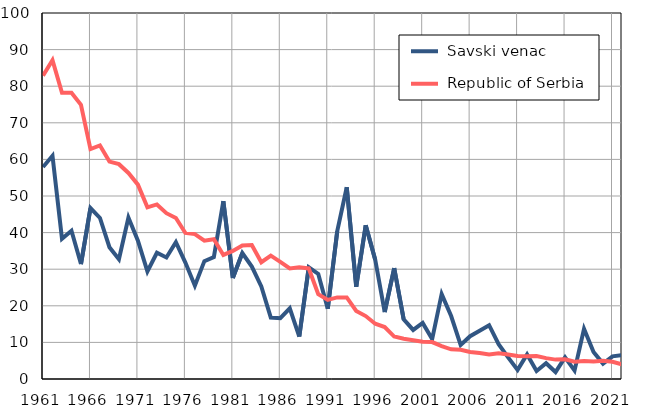
| Category |  Savski venac |  Republic of Serbia |
|---|---|---|
| 1961.0 | 57.9 | 82.9 |
| 1962.0 | 61 | 87.1 |
| 1963.0 | 38.3 | 78.2 |
| 1964.0 | 40.5 | 78.2 |
| 1965.0 | 31.4 | 74.9 |
| 1966.0 | 46.7 | 62.8 |
| 1967.0 | 44 | 63.8 |
| 1968.0 | 36 | 59.4 |
| 1969.0 | 32.7 | 58.7 |
| 1970.0 | 44.1 | 56.3 |
| 1971.0 | 37.8 | 53.1 |
| 1972.0 | 29.4 | 46.9 |
| 1973.0 | 34.5 | 47.7 |
| 1974.0 | 33.2 | 45.3 |
| 1975.0 | 37.4 | 44 |
| 1976.0 | 31.8 | 39.9 |
| 1977.0 | 25.5 | 39.6 |
| 1978.0 | 32.2 | 37.8 |
| 1979.0 | 33.3 | 38.2 |
| 1980.0 | 48.6 | 33.9 |
| 1981.0 | 27.6 | 35 |
| 1982.0 | 34.4 | 36.5 |
| 1983.0 | 30.7 | 36.6 |
| 1984.0 | 25.3 | 31.9 |
| 1985.0 | 16.8 | 33.7 |
| 1986.0 | 16.6 | 32 |
| 1987.0 | 19.3 | 30.2 |
| 1988.0 | 11.6 | 30.5 |
| 1989.0 | 30.5 | 30.2 |
| 1990.0 | 28.7 | 23.2 |
| 1991.0 | 19.2 | 21.6 |
| 1992.0 | 40.4 | 22.3 |
| 1993.0 | 52.4 | 22.3 |
| 1994.0 | 25.2 | 18.6 |
| 1995.0 | 42 | 17.2 |
| 1996.0 | 32.6 | 15.1 |
| 1997.0 | 18.3 | 14.2 |
| 1998.0 | 30.3 | 11.6 |
| 1999.0 | 16.3 | 11 |
| 2000.0 | 13.4 | 10.6 |
| 2001.0 | 15.3 | 10.2 |
| 2002.0 | 10.9 | 10.1 |
| 2003.0 | 23.2 | 9 |
| 2004.0 | 17.2 | 8.1 |
| 2005.0 | 9.3 | 8 |
| 2006.0 | 11.7 | 7.4 |
| 2007.0 | 13.2 | 7.1 |
| 2008.0 | 14.7 | 6.7 |
| 2009.0 | 9.5 | 7 |
| 2010.0 | 5.9 | 6.7 |
| 2011.0 | 2.5 | 6.3 |
| 2012.0 | 6.7 | 6.2 |
| 2013.0 | 2.2 | 6.3 |
| 2014.0 | 4.3 | 5.7 |
| 2015.0 | 1.9 | 5.3 |
| 2016.0 | 5.9 | 5.4 |
| 2017.0 | 2.3 | 4.7 |
| 2018.0 | 13.7 | 4.9 |
| 2019.0 | 7.4 | 4.8 |
| 2020.0 | 4.2 | 5 |
| 2021.0 | 6.2 | 4.7 |
| 2022.0 | 6.5 | 4 |